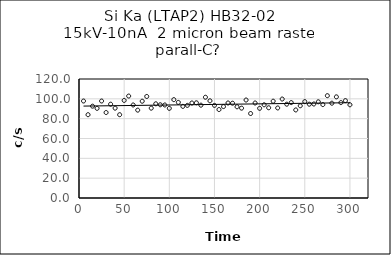
| Category | Series 0 |
|---|---|
| 5.0 | 97.8 |
| 10.0 | 84 |
| 15.0 | 92.6 |
| 20.0 | 90.4 |
| 25.0 | 97.8 |
| 30.0 | 86.2 |
| 35.0 | 94.6 |
| 40.0 | 90.6 |
| 45.0 | 84 |
| 50.0 | 98.4 |
| 55.0 | 102.8 |
| 60.0 | 93.8 |
| 65.0 | 88.6 |
| 70.0 | 97.6 |
| 75.0 | 102.4 |
| 80.0 | 90.6 |
| 85.0 | 95 |
| 90.0 | 94 |
| 95.0 | 93.8 |
| 100.0 | 90.4 |
| 105.0 | 99.2 |
| 110.0 | 96.4 |
| 115.0 | 92.4 |
| 120.0 | 93.4 |
| 125.0 | 95.8 |
| 130.0 | 96 |
| 135.0 | 93.6 |
| 140.0 | 101.6 |
| 145.0 | 98 |
| 150.0 | 93.4 |
| 155.0 | 89.2 |
| 160.0 | 92.2 |
| 165.0 | 95.8 |
| 170.0 | 95.6 |
| 175.0 | 92 |
| 180.0 | 90.6 |
| 185.0 | 98.8 |
| 190.0 | 85.2 |
| 195.0 | 95.8 |
| 200.0 | 90.4 |
| 205.0 | 94 |
| 210.0 | 91 |
| 215.0 | 97.6 |
| 220.0 | 90.8 |
| 225.0 | 99.8 |
| 230.0 | 94.6 |
| 235.0 | 96.2 |
| 240.0 | 88.8 |
| 245.0 | 93 |
| 250.0 | 97.2 |
| 255.0 | 94.6 |
| 260.0 | 94.8 |
| 265.0 | 97 |
| 270.0 | 94.2 |
| 275.0 | 103.2 |
| 280.0 | 95.6 |
| 285.0 | 102 |
| 290.0 | 96.2 |
| 295.0 | 98.2 |
| 300.0 | 94 |